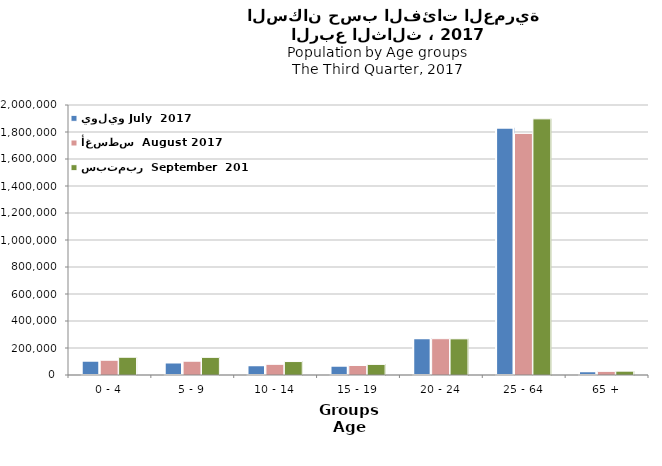
| Category | يوليو July  2017 | أغسطس  August 2017  | سبتمبر  September  2017  |
|---|---|---|---|
| 0 - 4 | 105318 | 109248 | 131541 |
| 5 - 9 | 92617 | 101978 | 130719 |
| 10 - 14 | 72344 | 79130 | 99584 |
| 15 - 19 | 68649 | 70542 | 78581 |
| 20 - 24 | 272977 | 268771 | 267904 |
| 25 - 64 | 1832125 | 1789724 | 1897430 |
| 65 + | 27889 | 26935 | 28475 |